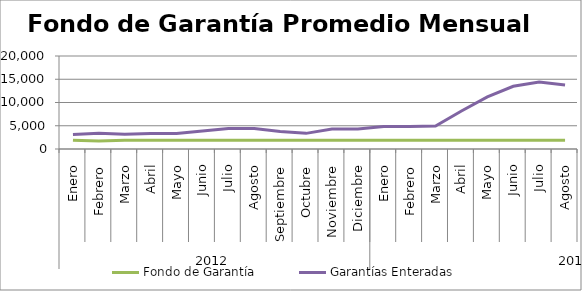
| Category | Fondo de Garantía | Garantías Enteradas |
|---|---|---|
| 0 | 1896.798 | 3141.641 |
| 1 | 1714.423 | 3362.648 |
| 2 | 1900.513 | 3154.118 |
| 3 | 1900.513 | 3348.058 |
| 4 | 1898.685 | 3308.859 |
| 5 | 1900.513 | 3850.375 |
| 6 | 1900.513 | 4400.539 |
| 7 | 1895.388 | 4383.327 |
| 8 | 1900.513 | 3757.632 |
| 9 | 1900.513 | 3362.932 |
| 10 | 1900.311 | 4285.609 |
| 11 | 1890.98 | 4296.87 |
| 12 | 1898.667 | 4842.786 |
| 13 | 1900.512 | 4845.136 |
| 14 | 1900.513 | 4938.365 |
| 15 | 1900.513 | 8179.666 |
| 16 | 1900.513 | 11202.213 |
| 17 | 1900.513 | 13493.433 |
| 18 | 1900.513 | 14387.844 |
| 19 | 1900.496 | 13769.803 |